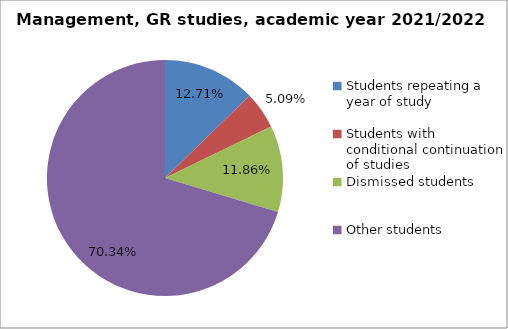
| Category | Series 0 |
|---|---|
| Students repeating a year of study | 15 |
| Students with conditional continuation of studies | 6 |
| Dismissed students | 14 |
| Other students | 83 |